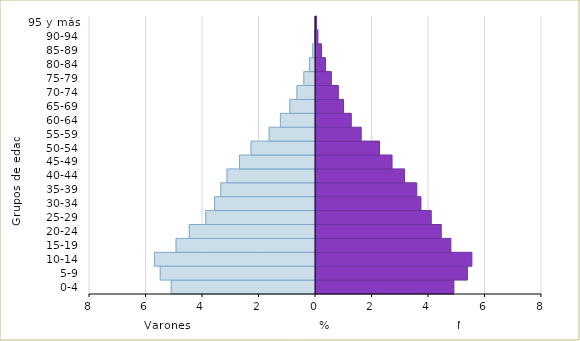
| Category | Varón  | Mujer |
|---|---|---|
| 0-4 | -5.108 | 4.88 |
| 5-9 | -5.497 | 5.359 |
| 10-14 | -5.701 | 5.517 |
| 15-19 | -4.936 | 4.773 |
| 20-24 | -4.467 | 4.433 |
| 25-29 | -3.885 | 4.079 |
| 30-34 | -3.57 | 3.715 |
| 35-39 | -3.354 | 3.567 |
| 40-44 | -3.133 | 3.136 |
| 45-49 | -2.69 | 2.692 |
| 50-54 | -2.283 | 2.248 |
| 55-59 | -1.642 | 1.6 |
| 60-64 | -1.243 | 1.248 |
| 65-69 | -0.908 | 0.972 |
| 70-74 | -0.657 | 0.791 |
| 75-79 | -0.412 | 0.542 |
| 80-84 | -0.211 | 0.334 |
| 85-89 | -0.098 | 0.195 |
| 90-94 | -0.026 | 0.068 |
| 95 y más | -0.009 | 0.021 |